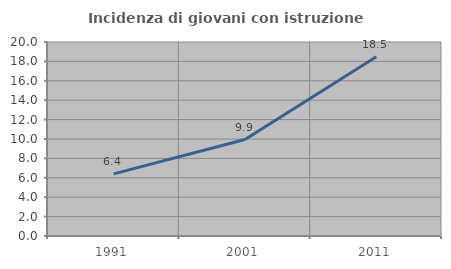
| Category | Incidenza di giovani con istruzione universitaria |
|---|---|
| 1991.0 | 6.407 |
| 2001.0 | 9.942 |
| 2011.0 | 18.486 |